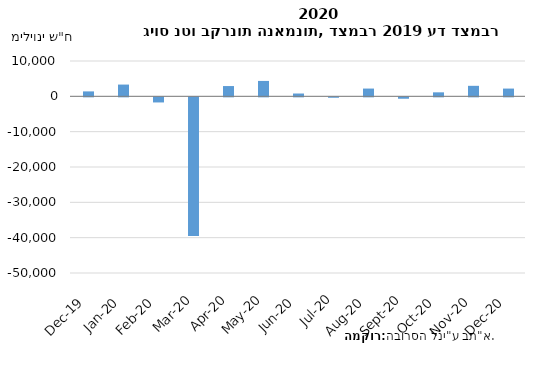
| Category | גיוס נטו בקרנות הנאמנות |
|---|---|
| 2019-12-01 | 1398.19 |
| 2020-01-01 | 3330.16 |
| 2020-02-01 | -1448.82 |
| 2020-03-01 | -39275.97 |
| 2020-04-01 | 2910.975 |
| 2020-05-01 | 4360.07 |
| 2020-06-01 | 797.36 |
| 2020-07-01 | -120.47 |
| 2020-08-01 | 2199.774 |
| 2020-09-01 | -400.32 |
| 2020-10-01 | 1134.091 |
| 2020-11-01 | 2973.977 |
| 2020-12-01 | 2197.011 |